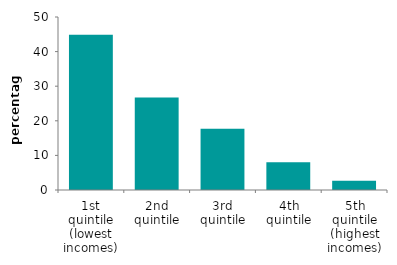
| Category | Series 0 |
|---|---|
| 1st quintile (lowest incomes) | 44.877 |
| 2nd quintile | 26.73 |
| 3rd quintile | 17.716 |
| 4th quintile | 8.019 |
| 5th quintile (highest incomes) | 2.658 |